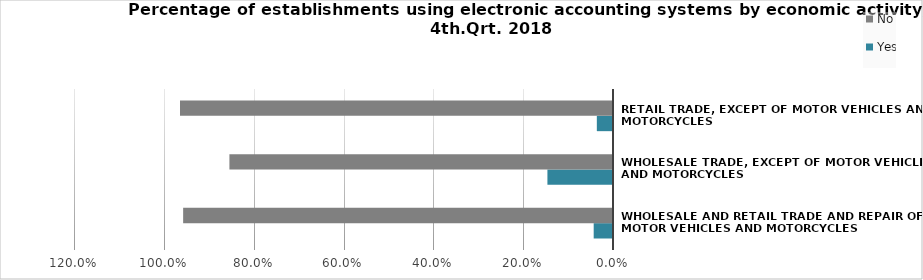
| Category | Yes | No |
|---|---|---|
| Wholesale and retail trade and repair of motor vehicles and motorcycles | 0.043 | 0.957 |
| Wholesale trade, except of motor vehicles and motorcycles | 0.146 | 0.854 |
| Retail trade, except of motor vehicles and motorcycles | 0.036 | 0.964 |